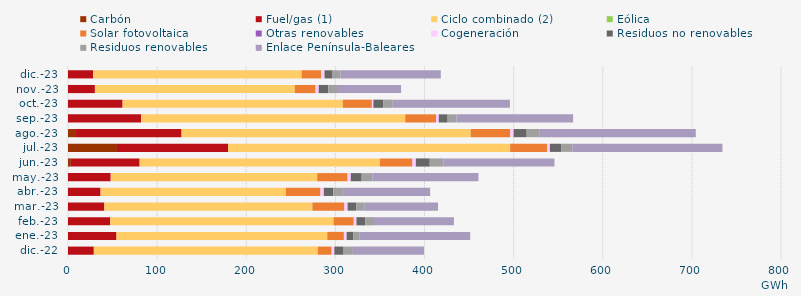
| Category | Carbón | Fuel/gas (1) | Ciclo combinado (2) | Eólica | Solar fotovoltaica | Otras renovables | Cogeneración | Residuos no renovables | Residuos renovables | Enlace Península-Baleares |
|---|---|---|---|---|---|---|---|---|---|---|
| dic.-22 | -0.627 | 28.98 | 251.185 | 0.101 | 15.536 | 0.077 | 2.941 | 10.414 | 10.414 | 79.779 |
| ene.-23 | -0.728 | 54.403 | 236.334 | 0.216 | 18.54 | 0.094 | 3.048 | 7.362 | 7.362 | 123.95 |
| feb.-23 | -0.707 | 47.337 | 250.507 | 0.183 | 22.493 | 0.136 | 3.002 | 9.83 | 9.83 | 89.734 |
| mar.-23 | -0.518 | 40.752 | 233.282 | 0.2 | 35.775 | 0.112 | 3.577 | 9.638 | 9.638 | 82.194 |
| abr.-23 | -0.609 | 36.577 | 207.738 | 0.127 | 38.851 | 0.074 | 3.618 | 10.657 | 10.657 | 98.033 |
| may.-23 | -0.833 | 47.925 | 231.475 | 0.25 | 34.005 | 0.09 | 3.517 | 12.229 | 12.229 | 118.762 |
| jun.-23 | 3.18 | 77.204 | 269.55 | 0.056 | 36.423 | 0.084 | 3.783 | 15.598 | 15.598 | 124.35 |
| jul.-23 | 54.925 | 124.683 | 316.355 | 0.119 | 41.343 | 0.037 | 3.245 | 12.541 | 12.541 | 168.548 |
| ago.-23 | 9.023 | 118.34 | 324.377 | 0.098 | 44.373 | 0.027 | 3.74 | 14.683 | 14.683 | 175.009 |
| sep.-23 | -0.823 | 82.054 | 296.323 | 0 | 34.511 | 0.032 | 3.105 | 9.934 | 9.934 | 130.855 |
| oct.-23 | -0.827 | 61.254 | 247.113 | 0.01 | 32.549 | 0.04 | 1.729 | 10.861 | 10.861 | 131.447 |
| nov.-23 | -0.895 | 30.185 | 224.261 | 0.009 | 23.299 | 0.073 | 3.462 | 10.81 | 10.81 | 70.768 |
| dic.-23 | -0.696 | 28.263 | 233.915 | 0 | 21.723 | 0.105 | 3.843 | 8.992 | 8.992 | 112.44 |